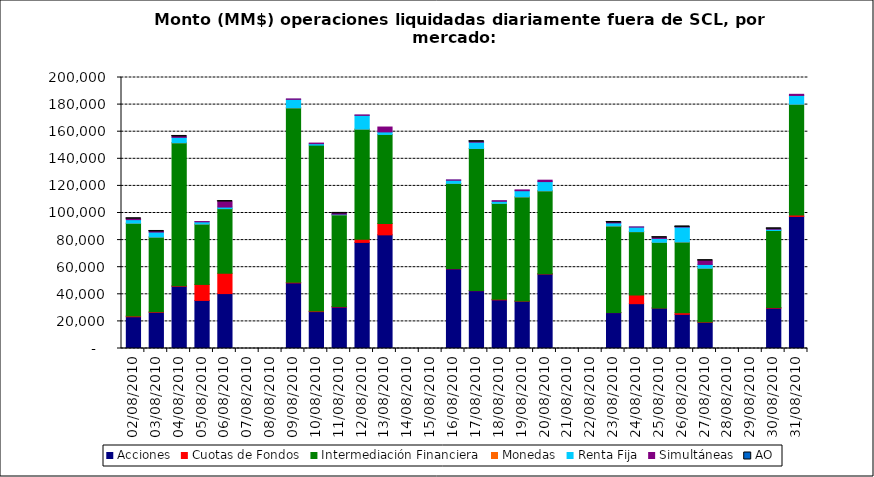
| Category | Acciones | Cuotas de Fondos | Intermediación Financiera | Monedas | Renta Fija | Simultáneas | AO |
|---|---|---|---|---|---|---|---|
| 02/08/2010 | 23446.861 | 562.466 | 68453.935 | 3.12 | 2640.176 | 642.217 | 0.01 |
| 03/08/2010 | 26719.468 | 324.075 | 55166.046 | 5.847 | 3714.59 | 436.681 | 0.007 |
| 04/08/2010 | 45937.738 | 344.413 | 105520.31 | 27.092 | 4002.058 | 649.312 | 0.05 |
| 05/08/2010 | 35478.951 | 11809.425 | 44544.171 | 0.39 | 1635.485 | 221.289 | 0 |
| 06/08/2010 | 40523.553 | 14931.123 | 47768.622 | 13.651 | 1143.58 | 4057.14 | 2.186 |
| 09/08/2010 | 48444.335 | 390.706 | 128759.732 | 12.22 | 6250.612 | 338.448 | 0 |
| 10/08/2010 | 27231.557 | 353.258 | 122509.286 | 0 | 1067.867 | 440.996 | 0 |
| 11/08/2010 | 30626.058 | 412.889 | 67629.692 | 1.58 | 444.625 | 576.428 | 0.142 |
| 12/08/2010 | 78295.76 | 2404.102 | 81194.258 | 2.734 | 10147.598 | 348.864 | 0 |
| 13/08/2010 | 83868.455 | 8372.434 | 65736.535 | 1.56 | 1859.074 | 3609.174 | 0 |
| 16/08/2010 | 58807.56 | 214.841 | 62842.016 | 2.73 | 2303.775 | 257.989 | 0 |
| 17/08/2010 | 42669.034 | 80.092 | 104887.776 | 2.73 | 4635.243 | 351.089 | 0.258 |
| 18/08/2010 | 35902.147 | 493.214 | 70711.955 | 1.155 | 1530.999 | 466.631 | 0 |
| 19/08/2010 | 34912.749 | 186.625 | 76781.406 | 17.112 | 4552.706 | 604.316 | 0 |
| 20/08/2010 | 54992.757 | 159.691 | 61216.169 | 3.8 | 6805.033 | 1044.807 | 0 |
| 23/08/2010 | 26470.649 | 122.49 | 63841.09 | 0.76 | 2290.361 | 282.183 | 0.2 |
| 24/08/2010 | 33072.43 | 6503.035 | 46656.255 | 7.409 | 3337.178 | 166.674 | 0 |
| 25/08/2010 | 29898.186 | 4.126 | 48450.824 | 12.405 | 2879.919 | 561.222 | 0.089 |
| 26/08/2010 | 25220.584 | 1215.32 | 52170.371 | 6.24 | 11043.13 | 62.961 | 0.01 |
| 27/08/2010 | 19367.481 | 270.03 | 39595.216 | 17.996 | 2778.637 | 2810.698 | 0.315 |
| 30/08/2010 | 29798.982 | 450.775 | 56814.4 | 0 | 929.477 | 325.995 | 0.01 |
| 31/08/2010 | 97482.23 | 953.7 | 81840.519 | 10.659 | 6461.603 | 837.415 | 0 |